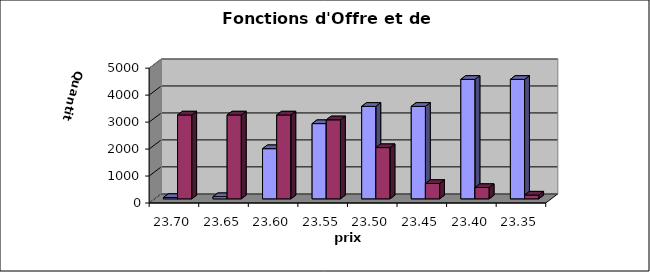
| Category | Series 0 | Series 1 |
|---|---|---|
| 23.7 | 50 | 3110 |
| 23.65 | 80 | 3110 |
| 23.6 | 1860 | 3110 |
| 23.55 | 2790 | 2930 |
| 23.5 | 3430 | 1900 |
| 23.45 | 3430 | 570 |
| 23.4 | 4430 | 420 |
| 23.35 | 4430 | 140 |